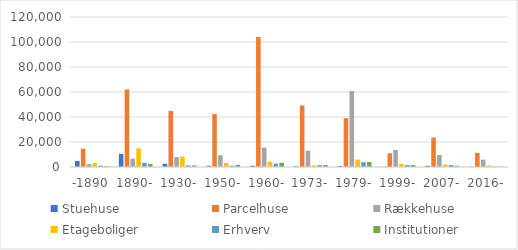
| Category | Stuehuse | Parcelhuse | Rækkehuse | Etageboliger | Erhverv | Institutioner |
|---|---|---|---|---|---|---|
| -1890 | 4864 | 14625 | 2348 | 3098 | 1088 | 613 |
| 1890- | 10485 | 62083 | 6678 | 14931 | 3379 | 2452 |
| 1930- | 2567 | 44781 | 7966 | 8265 | 1269 | 1279 |
| 1950- | 981 | 42356 | 9389 | 3175 | 1046 | 1685 |
| 1960- | 939 | 103909 | 15572 | 4307 | 2690 | 3415 |
| 1973- | 599 | 49269 | 13116 | 1280 | 1469 | 1602 |
| 1979- | 834 | 39042 | 60789 | 5959 | 3887 | 3951 |
| 1999- | 216 | 10981 | 13634 | 2487 | 1474 | 1589 |
| 2007- | 941 | 23614 | 9613 | 1912 | 1540 | 969 |
| 2016- | 286 | 11313 | 5892 | 1191 | 430 | 184 |